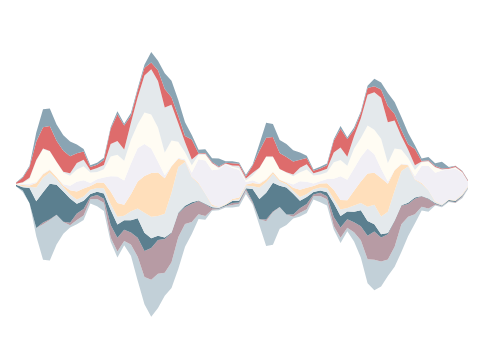
| Category | Область | Продажи | Маркетинг | Производство | Логистика | Техслужба | ИТ | Финансы | Бухгалтерия | Безопасность | Управление |
|---|---|---|---|---|---|---|---|---|---|---|---|
| 1.0 | 9020 | 0 | 0 | 97 | 24 | 6 | 10 | 25 | 7 | 62 | 7 |
| nan | 8650 | 95 | 0 | 211 | 65 | 75 | 78 | 64 | 37 | 298 | 56 |
| nan | 7930 | 0 | 0 | 979 | 74 | 86 | 106 | 319 | 75 | 685 | 87 |
| nan | 5820 | 532 | 0 | 1708 | 890 | 273 | 78 | 1364 | 37 | 1196 | 563 |
| 5.0 | 4310 | 2273 | 118 | 1943 | 930 | 218 | 51 | 1556 | 42 | 1360 | 1156 |
| nan | 4260 | 2593 | 53 | 2282 | 723 | 153 | 48 | 1132 | 43 | 1597 | 1123 |
| nan | 5290 | 1887 | 20 | 1920 | 376 | 120 | 2 | 960 | 14 | 1344 | 1046 |
| nan | 5980 | 755 | 9 | 1940 | 271 | 109 | 84 | 755 | 42 | 1358 | 985 |
| 9.0 | 6380 | 137 | 163 | 1559 | 259 | 263 | 292 | 637 | 163 | 1091 | 950 |
| nan | 6580 | 276 | 418 | 625 | 272 | 518 | 625 | 776 | 418 | 625 | 567 |
| nan | 6860 | 287 | 419 | 531 | 268 | 519 | 531 | 887 | 419 | 531 | 156 |
| nan | 7910 | 276 | 145 | 198 | 263 | 245 | 198 | 676 | 145 | 198 | 111 |
| 13.0 | 7740 | 472 | 249 | 203 | 253 | 349 | 203 | 472 | 249 | 203 | 135 |
| nan | 7430 | 532 | 261 | 332 | 337 | 361 | 332 | 532 | 261 | 332 | 138 |
| nan | 5470 | 273 | 793 | 979 | 376 | 793 | 979 | 1273 | 793 | 979 | 103 |
| nan | 4450 | 393 | 881 | 854 | 487 | 881 | 1708 | 1393 | 881 | 1708 | 188 |
| 17.0 | 5240 | 276 | 717 | 617 | 276 | 717 | 1543 | 1276 | 717 | 1543 | 106 |
| nan | 4570 | 718 | 762 | 793 | 572 | 1089 | 1982 | 1518 | 1089 | 462 | 157 |
| nan | 2960 | 1549 | 1212 | 1248 | 632 | 1731 | 2120 | 1549 | 1731 | 447 | 131 |
| nan | 1460 | 1749 | 1658 | 1176 | 1273 | 2369 | 2040 | 2033 | 2369 | 490 | 197 |
| 21.0 | 650 | 2376 | 2032 | 624 | 1393 | 2803 | 1559 | 2182 | 2903 | 429 | 674 |
| nan | 1210 | 2200 | 2160 | 273 | 1276 | 2786 | 683 | 2200 | 2986 | 683 | 603 |
| nan | 2010 | 1465 | 2162 | 98 | 1518 | 2289 | 180 | 1465 | 2889 | 1180 | 1010 |
| nan | 2500 | 1643 | 1885 | 30 | 2549 | 1693 | 17 | 1643 | 2293 | 471 | 1058 |
| 25.0 | 3720 | 2035 | 1525 | 50 | 2933 | 525 | 55 | 1035 | 1178 | 483 | 1012 |
| nan | 5140 | 1462 | 1075 | 99 | 2802 | 90 | 79 | 462 | 635 | 400 | 886 |
| nan | 5960 | 769 | 1168 | 97 | 1600 | 41 | 246 | 490 | 368 | 1283 | 287 |
| nan | 6920 | 303 | 855 | 33 | 1065 | 74 | 1499 | 294 | 57 | 40 | 219 |
| 29.0 | 6880 | 238 | 743 | 40 | 643 | 15 | 2122 | 353 | 64 | 56 | 241 |
| nan | 7450 | 59 | 96 | 69 | 75 | 81 | 2211 | 434 | 37 | 71 | 240 |
| nan | 7480 | 90 | 19 | 41 | 62 | 24 | 2400 | 51 | 67 | 53 | 512 |
| nan | 7660 | 80 | 19 | 64 | 5 | 37 | 2561 | 20 | 29 | 61 | 85 |
| 33.0 | 7660 | 163 | 122 | 126 | 68 | 67 | 1983 | 84 | 72 | 149 | 123 |
| nan | 7720 | 178 | 75 | 117 | 94 | 120 | 1783 | 93 | 158 | 130 | 81 |
| nan | 8520 | 213 | 122 | 42 | 168 | 72 | 157 | 94 | 132 | 130 | 115 |
| nan | 7860 | 88 | 98 | 796 | 179 | 204 | 179 | 313 | 167 | 466 | 68 |
| 37.0 | 6530 | 373 | 0 | 1299 | 739 | 222 | 68 | 955 | 30 | 1077 | 445 |
| nan | 5190 | 1592 | 106 | 1710 | 679 | 179 | 42 | 1401 | 36 | 1197 | 960 |
| nan | 5280 | 2075 | 46 | 1849 | 550 | 132 | 36 | 917 | 38 | 1262 | 820 |
| nan | 6300 | 1378 | 15 | 1364 | 290 | 89 | 2 | 682 | 13 | 1022 | 827 |
| 41.0 | 6540 | 672 | 7 | 1727 | 209 | 87 | 59 | 582 | 34 | 978 | 838 |
| nan | 6960 | 109 | 144 | 1326 | 195 | 185 | 208 | 529 | 115 | 841 | 713 |
| nan | 7090 | 227 | 301 | 469 | 243 | 467 | 544 | 575 | 297 | 507 | 465 |
| nan | 7300 | 244 | 336 | 447 | 201 | 405 | 372 | 799 | 332 | 404 | 130 |
| 45.0 | 8170 | 219 | 109 | 149 | 187 | 204 | 165 | 514 | 131 | 173 | 83 |
| nan | 8000 | 392 | 217 | 149 | 180 | 262 | 147 | 421 | 212 | 173 | 122 |
| nan | 7790 | 394 | 201 | 259 | 263 | 304 | 273 | 431 | 222 | 233 | 115 |
| nan | 6250 | 227 | 579 | 882 | 275 | 579 | 705 | 1070 | 619 | 754 | 89 |
| 49.0 | 5390 | 335 | 652 | 743 | 405 | 617 | 1521 | 1045 | 793 | 1213 | 170 |
| nan | 6140 | 216 | 553 | 494 | 219 | 502 | 1312 | 906 | 567 | 1142 | 94 |
| nan | 5480 | 589 | 641 | 675 | 407 | 948 | 1428 | 1276 | 785 | 416 | 142 |
| nan | 4450 | 1116 | 885 | 1036 | 456 | 1385 | 1569 | 1224 | 1247 | 331 | 118 |
| 53.0 | 2810 | 1540 | 1493 | 953 | 917 | 2133 | 1592 | 1485 | 1967 | 437 | 140 |
| nan | 2360 | 1949 | 1809 | 468 | 1254 | 2047 | 1185 | 1572 | 2410 | 378 | 486 |
| nan | 2600 | 1606 | 1534 | 200 | 1136 | 2480 | 581 | 1936 | 2628 | 526 | 453 |
| nan | 3270 | 1055 | 1622 | 75 | 1367 | 1786 | 155 | 1187 | 2601 | 1051 | 839 |
| 57.0 | 3860 | 1282 | 1659 | 21 | 1912 | 1321 | 14 | 1381 | 1789 | 410 | 773 |
| nan | 4810 | 1771 | 1190 | 37 | 2200 | 420 | 47 | 911 | 849 | 392 | 840 |
| nan | 5840 | 1229 | 817 | 72 | 2326 | 77 | 59 | 416 | 528 | 348 | 727 |
| nan | 6630 | 593 | 993 | 81 | 1136 | 37 | 192 | 407 | 302 | 1040 | 233 |
| 61.0 | 7470 | 231 | 676 | 28 | 767 | 56 | 1110 | 227 | 47 | 30 | 167 |
| nan | 7390 | 210 | 602 | 30 | 534 | 14 | 1550 | 265 | 54 | 42 | 201 |
| nan | 7790 | 43 | 71 | 49 | 53 | 60 | 1814 | 348 | 31 | 61 | 171 |
| nan | 7680 | 68 | 16 | 32 | 53 | 22 | 2160 | 39 | 49 | 45 | 431 |
| 65.0 | 8010 | 56 | 16 | 57 | 4 | 32 | 1921 | 15 | 26 | 51 | 75 |
| nan | 7950 | 9 | 48 | 64 | 44 | 23 | 2007 | 67 | 43 | 70 | 5 |
| nan | 8260 | 73 | 43 | 59 | 37 | 47 | 1375 | 19 | 23 | 51 | 22 |
| nan | 8940 | 64 | 18 | 10 | 73 | 38 | 54 | 10 | 40 | 36 | 46 |